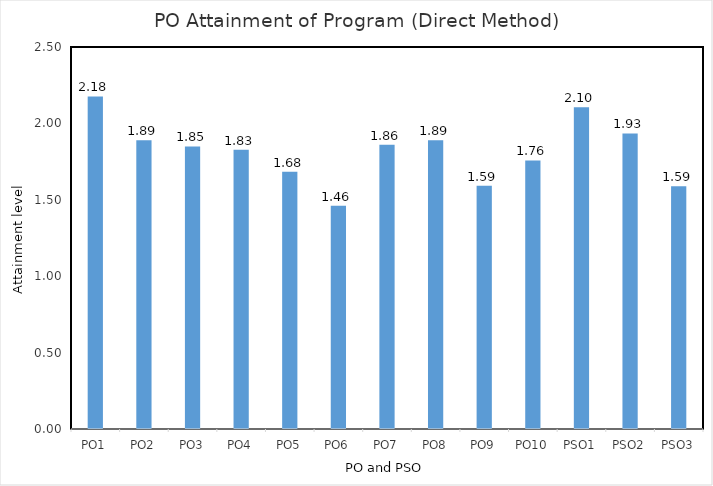
| Category | PO1 |
|---|---|
| PO1 | 2.177 |
| PO2 | 1.889 |
| PO3 | 1.849 |
| PO4 | 1.827 |
| PO5 | 1.684 |
| PO6 | 1.46 |
| PO7 | 1.861 |
| PO8 | 1.89 |
| PO9 | 1.592 |
| PO10 | 1.758 |
| PSO1 | 2.105 |
| PSO2 | 1.934 |
| PSO3 | 1.589 |